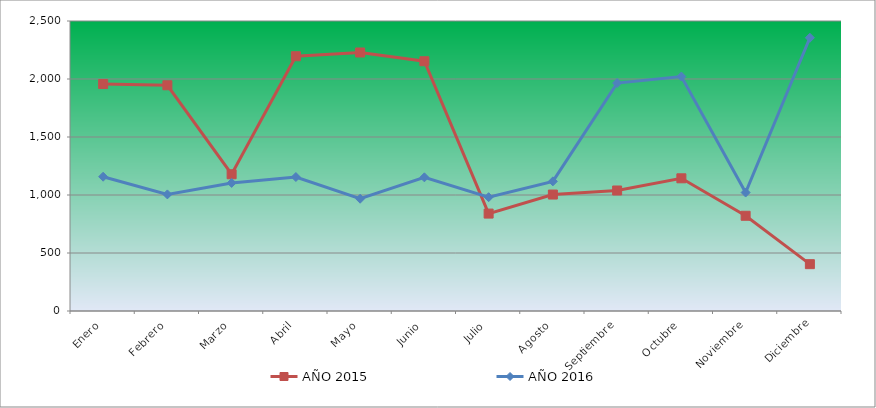
| Category | AÑO 2015 | AÑO 2016 |
|---|---|---|
| Enero | 1956.689 | 1157.629 |
| Febrero | 1945.923 | 1005.239 |
| Marzo | 1178.858 | 1104.159 |
| Abril | 2196.229 | 1154.956 |
| Mayo | 2228.526 | 967.81 |
| Junio | 2153.165 | 1152.282 |
| Julio | 839.735 | 981.178 |
| Agosto | 1003.913 | 1117.526 |
| Septiembre | 1038.902 | 1965.029 |
| Octubre | 1143.869 | 2021.172 |
| Noviembre | 820.894 | 1021.28 |
| Diciembre | 403.719 | 2355.361 |